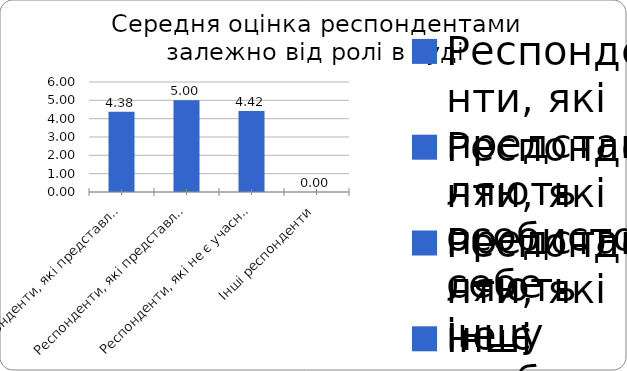
| Category | Series 0 |
|---|---|
| Респонденти, які представляють особисто себе | 4.375 |
| Респонденти, які представляють іншу особу | 5 |
| Респонденти, які не є учасниками судових проваджень | 4.421 |
| Інші респонденти | 0 |